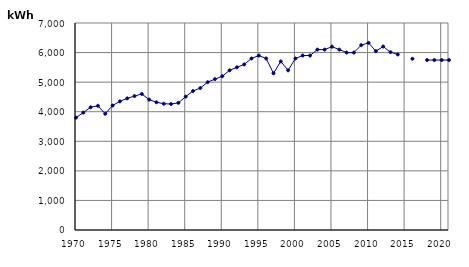
| Category | kWh |
|---|---|
| 1970.0 | 3800 |
| 1971.0 | 3970 |
| 1972.0 | 4150 |
| 1973.0 | 4200 |
| 1974.0 | 3930 |
| 1975.0 | 4210 |
| 1976.0 | 4350 |
| 1977.0 | 4450 |
| 1978.0 | 4530 |
| 1979.0 | 4600 |
| 1980.0 | 4410 |
| 1981.0 | 4320 |
| 1982.0 | 4270 |
| 1983.0 | 4260 |
| 1984.0 | 4300 |
| 1985.0 | 4510 |
| 1986.0 | 4700 |
| 1987.0 | 4800 |
| 1988.0 | 5000 |
| 1989.0 | 5100 |
| 1990.0 | 5200 |
| 1991.0 | 5400 |
| 1992.0 | 5500 |
| 1993.0 | 5600 |
| 1994.0 | 5800 |
| 1995.0 | 5900 |
| 1996.0 | 5800 |
| 1997.0 | 5300 |
| 1998.0 | 5700 |
| 1999.0 | 5400 |
| 2000.0 | 5800 |
| 2001.0 | 5900 |
| 2002.0 | 5900 |
| 2003.0 | 6100 |
| 2004.0 | 6100 |
| 2005.0 | 6200 |
| 2006.0 | 6100 |
| 2007.0 | 6000 |
| 2008.0 | 6000 |
| 2009.0 | 6249.909 |
| 2010.0 | 6326.873 |
| 2011.0 | 6047.482 |
| 2012.0 | 6204.612 |
| 2013.0 | 6014.448 |
| 2014.0 | 5935.345 |
| 2015.0 | 0 |
| 2016.0 | 5789.522 |
| 2017.0 | 0 |
| 2018.0 | 5746.621 |
| 2019.0 | 5746.621 |
| 2020.0 | 5746.621 |
| 2021.0 | 5746.621 |